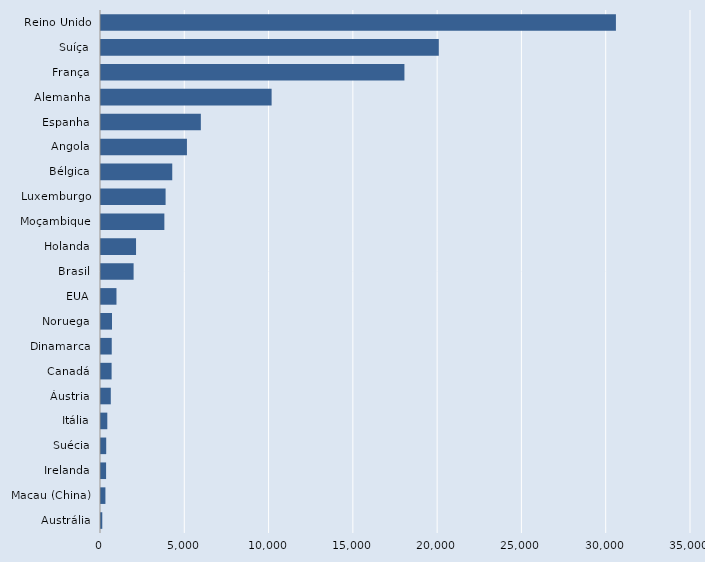
| Category | Series 0 |
|---|---|
| Austrália | 76 |
| Macau (China) | 262 |
| Irelanda | 302 |
| Suécia | 309 |
| Itália | 374 |
| Áustria | 581 |
| Canadá | 629 |
| Dinamarca | 637 |
| Noruega | 653 |
| EUA | 918 |
| Brasil | 1934 |
| Holanda | 2079 |
| Moçambique | 3759 |
| Luxemburgo | 3832 |
| Bélgica | 4227 |
| Angola | 5098 |
| Espanha | 5923 |
| Alemanha | 10121 |
| França | 18000 |
| Suíça | 20039 |
| Reino Unido | 30546 |